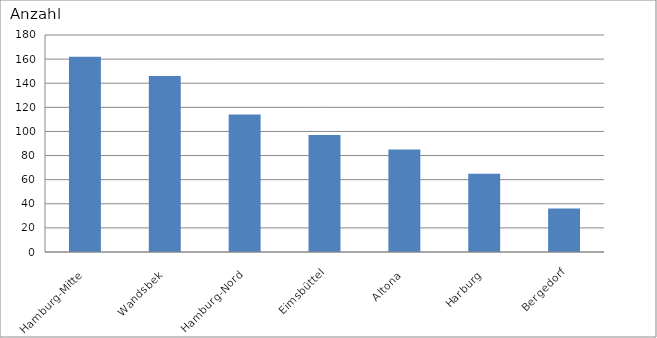
| Category | Hamburg-Mitte Wandsbek Hamburg-Nord Eimsbüttel Altona Harburg Bergedorf |
|---|---|
| Hamburg-Mitte | 162 |
| Wandsbek | 146 |
| Hamburg-Nord | 114 |
| Eimsbüttel | 97 |
| Altona | 85 |
| Harburg | 65 |
| Bergedorf | 36 |